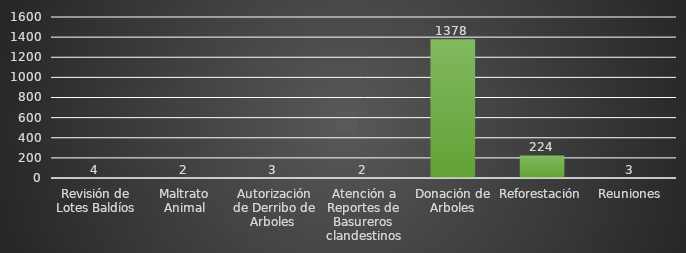
| Category | INDICADOR  |
|---|---|
| Revisión de Lotes Baldíos | 4 |
| Maltrato Animal | 2 |
| Autorización de Derribo de Arboles  | 3 |
| Atención a Reportes de Basureros clandestinos | 2 |
| Donación de Arboles | 1378 |
| Reforestación  | 224 |
| Reuniones | 3 |